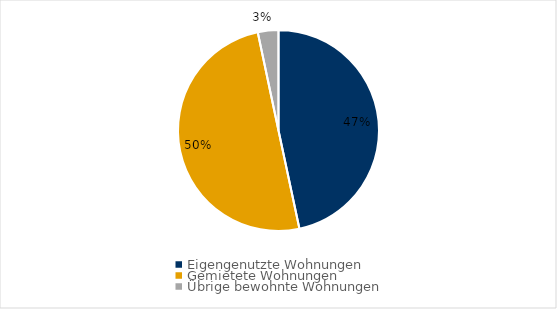
| Category | Series 0 |
|---|---|
| Eigengenutzte Wohnungen | 0.467 |
| Gemietete Wohnungen | 0.5 |
| Übrige bewohnte Wohnungen | 0.033 |